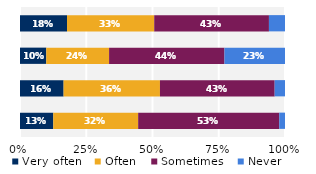
| Category | Very often | Often | Sometimes | Never |
|---|---|---|---|---|
| Talked about students' career plans | 0.177 | 0.329 | 0.433 | 0.061 |
| Worked on activities other than 
coursework | 0.099 | 0.237 | 0.435 | 0.228 |
| Discussed course topics, ideas, or concepts 
outside of class | 0.165 | 0.364 | 0.433 | 0.039 |
| Discussed students' academic performance | 0.126 | 0.32 | 0.532 | 0.022 |